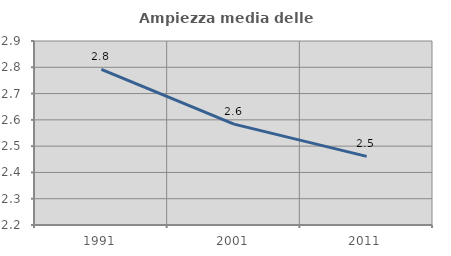
| Category | Ampiezza media delle famiglie |
|---|---|
| 1991.0 | 2.792 |
| 2001.0 | 2.584 |
| 2011.0 | 2.461 |